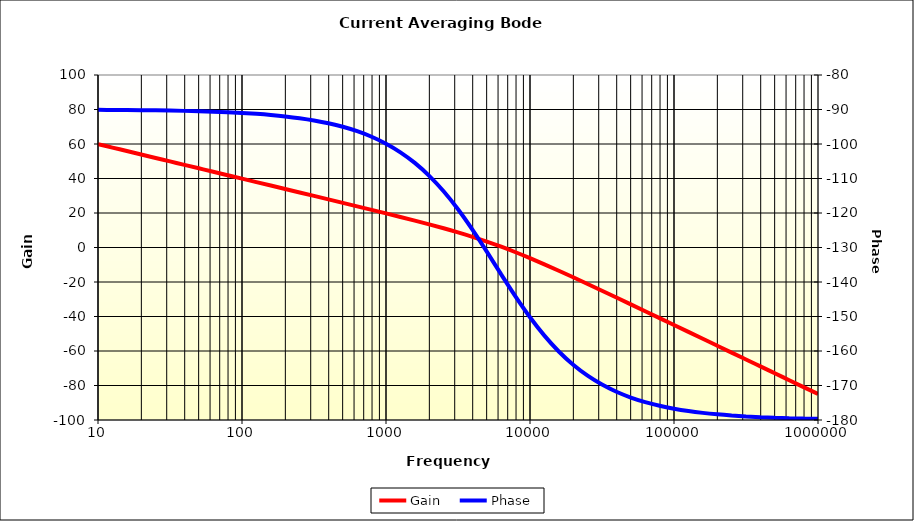
| Category | Gain |
|---|---|
| 10.0 | 59.918 |
| 12.58925411794168 | 57.918 |
| 15.848931924611136 | 55.918 |
| 19.952623149688804 | 53.918 |
| 25.1188643150958 | 51.918 |
| 31.622776601683803 | 49.918 |
| 39.810717055349755 | 47.917 |
| 50.11872336272724 | 45.917 |
| 63.095734448019364 | 43.917 |
| 79.4328234724282 | 41.917 |
| 100.0 | 39.916 |
| 125.89254117941677 | 37.916 |
| 158.48931924611153 | 35.914 |
| 199.52623149688802 | 33.912 |
| 251.18864315095806 | 31.909 |
| 316.22776601683825 | 29.904 |
| 398.1071705534976 | 27.897 |
| 501.1872336272727 | 25.884 |
| 630.9573444801932 | 23.865 |
| 794.3282347242821 | 21.835 |
| 1000.0 | 19.787 |
| 1258.925411794168 | 17.712 |
| 1584.8931924611156 | 15.597 |
| 1995.2623149688804 | 13.42 |
| 2511.886431509581 | 11.153 |
| 3162.2776601683804 | 8.761 |
| 3981.071705534977 | 6.204 |
| 5011.872336272732 | 3.446 |
| 6309.573444801938 | 0.463 |
| 7943.282347242815 | -2.745 |
| 10000.0 | -6.16 |
| 12589.254117941671 | -9.745 |
| 15848.931924611146 | -13.461 |
| 19952.623149688792 | -17.272 |
| 25118.86431509586 | -21.149 |
| 31622.77660168384 | -25.069 |
| 39810.71705534974 | -29.018 |
| 50118.723362727294 | -32.985 |
| 63095.73444801934 | -36.965 |
| 79432.82347242824 | -40.952 |
| 100000.0 | -44.943 |
| 125892.54117941685 | -48.938 |
| 158489.31924611164 | -52.935 |
| 199526.23149688813 | -56.933 |
| 251188.64315095844 | -60.931 |
| 316227.7660168382 | -64.93 |
| 398107.17055349716 | -68.93 |
| 501187.23362727347 | -72.93 |
| 630957.3444801942 | -76.929 |
| 794328.2347242833 | -80.929 |
| 1000000.0 | -84.929 |